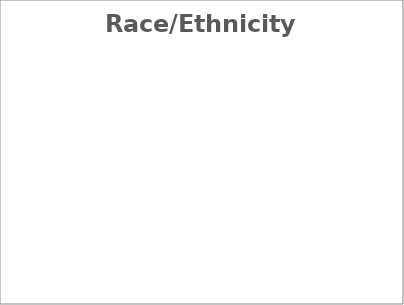
| Category | Count of Behavior Referrals |  Count of In School Removals |  Count of Out of School Suspensions |  Count of Expulsions  |
|---|---|---|---|---|
| 0.0 | 0 | 0 | 0 | 0 |
| 1.0 | 0 | 0 | 0 | 0 |
| 2.0 | 0 | 0 | 0 | 0 |
| 3.0 | 0 | 0 | 0 | 0 |
| 4.0 | 0 | 0 | 0 | 0 |
| 5.0 | 0 | 0 | 0 | 0 |
| 6.0 | 0 | 0 | 0 | 0 |
| 7.0 | 0 | 0 | 0 | 0 |
| 8.0 | 0 | 0 | 0 | 0 |
| 9.0 | 0 | 0 | 0 | 0 |
| 10.0 | 0 | 0 | 0 | 0 |
| 11.0 | 0 | 0 | 0 | 0 |
| 12.0 | 0 | 0 | 0 | 0 |